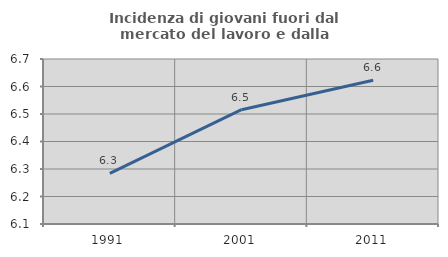
| Category | Incidenza di giovani fuori dal mercato del lavoro e dalla formazione  |
|---|---|
| 1991.0 | 6.284 |
| 2001.0 | 6.516 |
| 2011.0 | 6.623 |